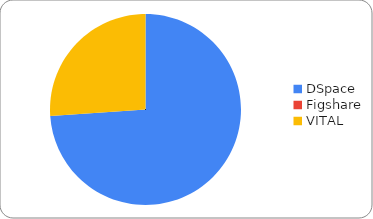
| Category | Series 0 |
|---|---|
| DSpace | 17 |
| Figshare | 0 |
| VITAL | 6 |